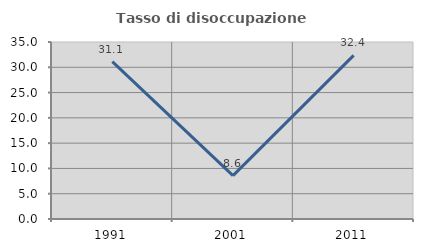
| Category | Tasso di disoccupazione giovanile  |
|---|---|
| 1991.0 | 31.111 |
| 2001.0 | 8.571 |
| 2011.0 | 32.353 |